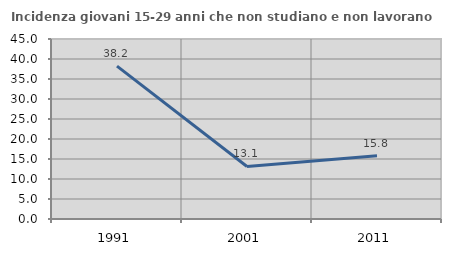
| Category | Incidenza giovani 15-29 anni che non studiano e non lavorano  |
|---|---|
| 1991.0 | 38.206 |
| 2001.0 | 13.141 |
| 2011.0 | 15.816 |